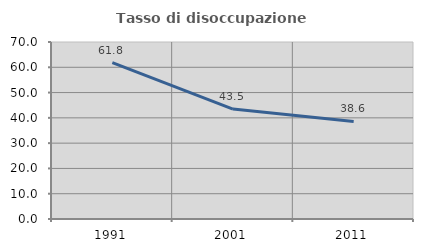
| Category | Tasso di disoccupazione giovanile  |
|---|---|
| 1991.0 | 61.836 |
| 2001.0 | 43.478 |
| 2011.0 | 38.596 |